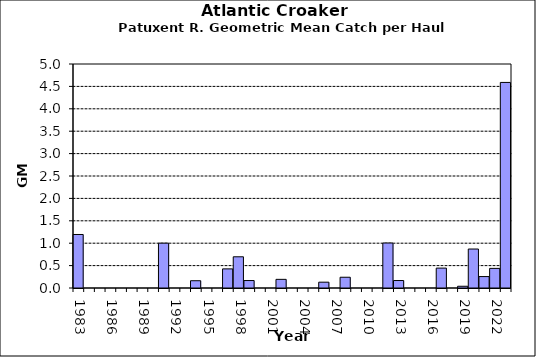
| Category | Series 0 |
|---|---|
| 1983.0 | 1.195 |
| 1984.0 | 0 |
| 1985.0 | 0 |
| 1986.0 | 0 |
| 1987.0 | 0 |
| 1988.0 | 0 |
| 1989.0 | 0 |
| 1990.0 | 0 |
| 1991.0 | 1.001 |
| 1992.0 | 0 |
| 1993.0 | 0 |
| 1994.0 | 0.162 |
| 1995.0 | 0 |
| 1996.0 | 0 |
| 1997.0 | 0.427 |
| 1998.0 | 0.697 |
| 1999.0 | 0.167 |
| 2000.0 | 0 |
| 2001.0 | 0 |
| 2002.0 | 0.193 |
| 2003.0 | 0 |
| 2004.0 | 0 |
| 2005.0 | 0 |
| 2006.0 | 0.13 |
| 2007.0 | 0 |
| 2008.0 | 0.24 |
| 2009.0 | 0 |
| 2010.0 | 0 |
| 2011.0 | 0 |
| 2012.0 | 1.004 |
| 2013.0 | 0.167 |
| 2014.0 | 0 |
| 2015.0 | 0 |
| 2016.0 | 0 |
| 2017.0 | 0.444 |
| 2018.0 | 0 |
| 2019.0 | 0.039 |
| 2020.0 | 0.87 |
| 2021.0 | 0.255 |
| 2022.0 | 0.438 |
| 2023.0 | 4.589 |